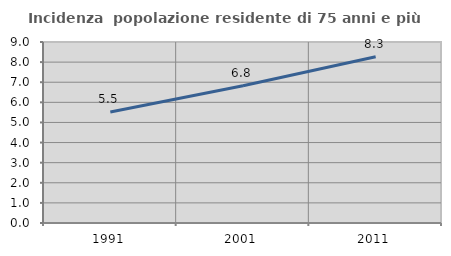
| Category | Incidenza  popolazione residente di 75 anni e più |
|---|---|
| 1991.0 | 5.523 |
| 2001.0 | 6.823 |
| 2011.0 | 8.264 |